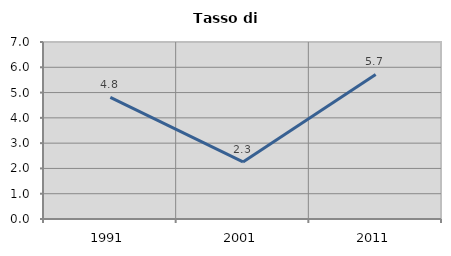
| Category | Tasso di disoccupazione   |
|---|---|
| 1991.0 | 4.812 |
| 2001.0 | 2.256 |
| 2011.0 | 5.718 |